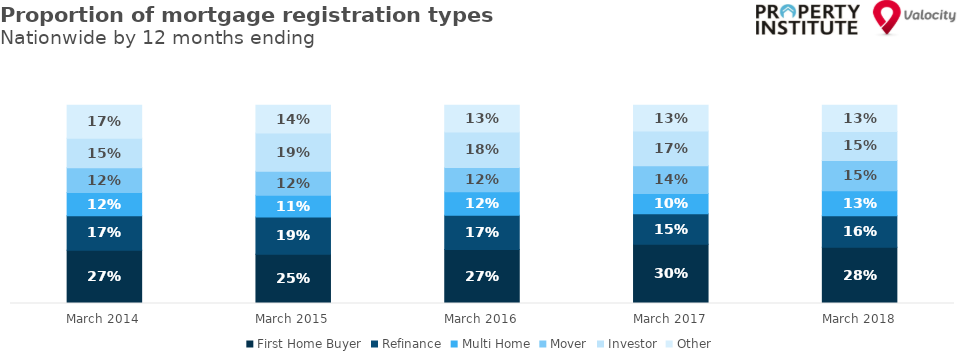
| Category | First Home Buyer | Refinance | Multi Home | Mover | Investor | Other |
|---|---|---|---|---|---|---|
| 2014-03-01 | 0.269 | 0.174 | 0.118 | 0.124 | 0.15 | 0.166 |
| 2015-03-01 | 0.249 | 0.188 | 0.11 | 0.121 | 0.192 | 0.14 |
| 2016-03-01 | 0.272 | 0.173 | 0.119 | 0.121 | 0.18 | 0.135 |
| 2017-03-01 | 0.298 | 0.154 | 0.103 | 0.139 | 0.175 | 0.131 |
| 2018-03-01 | 0.284 | 0.158 | 0.126 | 0.153 | 0.146 | 0.133 |